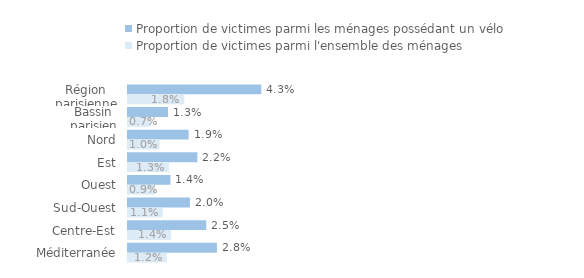
| Category | Proportion de victimes parmi les ménages possédant un vélo | Proportion de victimes parmi l'ensemble des ménages |
|---|---|---|
| Région parisienne | 0.043 | 0.018 |
| Bassin parisien | 0.013 | 0.007 |
| Nord | 0.019 | 0.01 |
| Est | 0.022 | 0.013 |
| Ouest | 0.014 | 0.009 |
| Sud-Ouest | 0.02 | 0.011 |
| Centre-Est | 0.025 | 0.014 |
| Méditerranée | 0.028 | 0.012 |